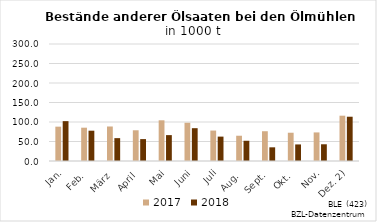
| Category | 2017 | 2018 |
|---|---|---|
| Jan. | 88.062 | 102.193 |
| Feb. | 85.416 | 77.703 |
| März | 88.479 | 58.626 |
| April | 78.788 | 56.17 |
| Mai | 104.366 | 66.375 |
| Juni | 98.078 | 84.124 |
| Juli | 78.064 | 62.53 |
| Aug. | 64.796 | 51.886 |
| Sept. | 76.338 | 35.069 |
| Okt. | 72.498 | 42.476 |
| Nov. | 73.283 | 42.882 |
| Dez. 2) | 116.166 | 113.53 |